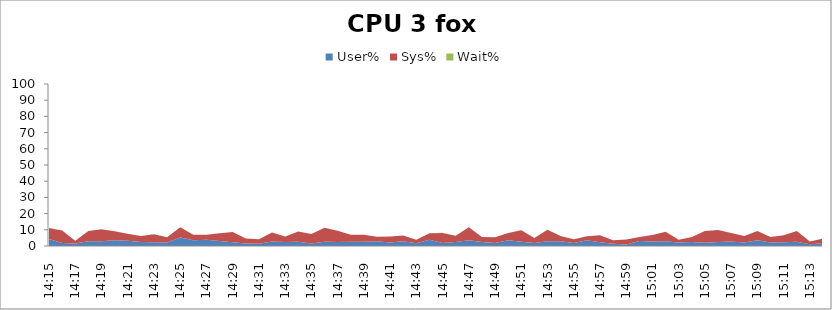
| Category | User% | Sys% | Wait% |
|---|---|---|---|
| 14:15 | 4.3 | 6.8 | 0.1 |
| 14:16 | 1.8 | 7.7 | 0 |
| 14:17 | 1.5 | 1.7 | 0 |
| 14:18 | 2.9 | 6.4 | 0 |
| 14:19 | 3 | 7.4 | 0 |
| 14:20 | 3.5 | 5.6 | 0 |
| 14:21 | 3.2 | 4.4 | 0 |
| 14:22 | 2.4 | 3.8 | 0 |
| 14:23 | 2.3 | 5 | 0 |
| 14:24 | 2.1 | 3.3 | 0 |
| 14:25 | 5.3 | 6.3 | 0 |
| 14:26 | 3.6 | 3.3 | 0 |
| 14:27 | 3.9 | 3 | 0 |
| 14:28 | 3.1 | 4.8 | 0 |
| 14:29 | 2.3 | 6.4 | 0 |
| 14:30 | 1.6 | 3 | 0 |
| 14:31 | 1.4 | 2.8 | 0 |
| 14:32 | 2.8 | 5.5 | 0 |
| 14:33 | 2.4 | 3.4 | 0 |
| 14:34 | 2.7 | 6.3 | 0 |
| 14:35 | 1.6 | 5.8 | 0 |
| 14:36 | 2.7 | 8.5 | 0 |
| 14:37 | 2.4 | 7 | 0 |
| 14:38 | 2.7 | 4.2 | 0 |
| 14:39 | 2.7 | 4.2 | 0 |
| 14:40 | 2.9 | 2.8 | 0 |
| 14:41 | 2.2 | 3.7 | 0 |
| 14:42 | 3 | 3.5 | 0 |
| 14:43 | 1.7 | 2.1 | 0 |
| 14:44 | 3.9 | 3.9 | 0.1 |
| 14:45 | 1.8 | 6.3 | 0.1 |
| 14:46 | 2.4 | 3.9 | 0 |
| 14:47 | 3.6 | 7.9 | 0 |
| 14:48 | 2.5 | 3 | 0 |
| 14:49 | 1.8 | 3.6 | 0 |
| 14:50 | 3.5 | 4.6 | 0 |
| 14:51 | 2.7 | 7 | 0.1 |
| 14:52 | 1.8 | 3.1 | 0 |
| 14:53 | 2.9 | 7.2 | 0 |
| 14:54 | 3 | 3.1 | 0 |
| 14:55 | 1.8 | 2.3 | 0 |
| 14:56 | 3.5 | 2.5 | 0 |
| 14:57 | 2.3 | 4.3 | 0 |
| 14:58 | 1.4 | 2.2 | 0 |
| 14:59 | 0.9 | 3.1 | 0 |
| 15:00 | 3.1 | 2.5 | 0 |
| 15:01 | 2.8 | 4 | 0 |
| 15:02 | 3 | 5.8 | 0 |
| 15:03 | 2.2 | 1.6 | 0 |
| 15:04 | 2.4 | 3.2 | 0 |
| 15:05 | 2 | 7.3 | 0 |
| 15:06 | 2.4 | 7.5 | 0 |
| 15:07 | 2.8 | 5.3 | 0 |
| 15:08 | 2.2 | 4 | 0 |
| 15:09 | 3.5 | 5.7 | 0 |
| 15:10 | 2.2 | 3.4 | 0 |
| 15:11 | 2.3 | 4.3 | 0 |
| 15:12 | 2.6 | 6.6 | 0 |
| 15:13 | 1.1 | 1.7 | 0 |
| 15:14 | 1.8 | 2.8 | 0 |